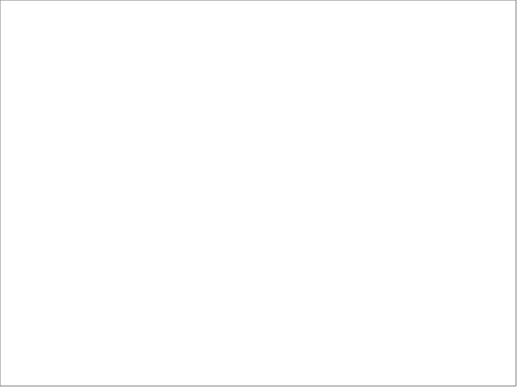
| Category | Total |
|---|---|
| Biosimilar | 8 |
| Licence change | 78 |
| New product | 79 |